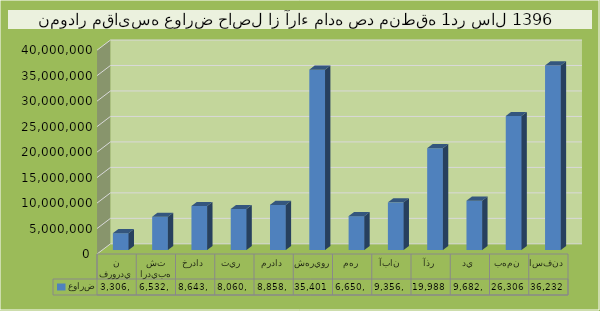
| Category | عوارض |
|---|---|
| فروردين | 3306646 |
| ارديبهشت | 6532230 |
| خرداد | 8643474 |
| تير  | 8060679 |
| مرداد | 8858474 |
| شهريور | 35401503 |
| مهر | 6650196 |
| آبان | 9356431 |
| آذر | 19988107 |
| دي | 9682857 |
| بهمن | 26306068 |
| اسفند | 36232653 |